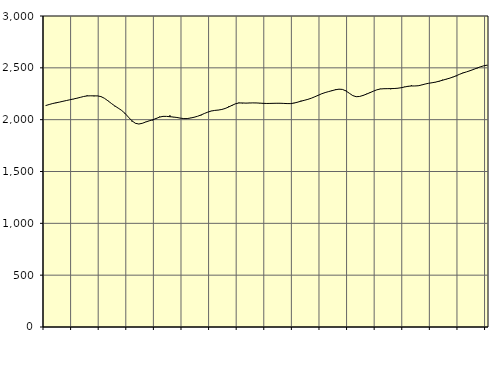
| Category | Piggar | Series 1 |
|---|---|---|
| nan | 2134.4 | 2136.11 |
| 87.0 | 2146.2 | 2146.18 |
| 87.0 | 2157.8 | 2155.55 |
| 87.0 | 2159.8 | 2162.88 |
| nan | 2168.8 | 2169.55 |
| 88.0 | 2177.6 | 2177.21 |
| 88.0 | 2183.8 | 2184.73 |
| 88.0 | 2192.1 | 2191.84 |
| nan | 2197.4 | 2199.26 |
| 89.0 | 2208.6 | 2206.71 |
| 89.0 | 2214.6 | 2215 |
| 89.0 | 2223 | 2223.6 |
| nan | 2234.6 | 2229.07 |
| 90.0 | 2229.1 | 2230.02 |
| 90.0 | 2225.9 | 2229.69 |
| 90.0 | 2230.2 | 2229.18 |
| nan | 2224.9 | 2222.76 |
| 91.0 | 2206 | 2206.45 |
| 91.0 | 2180.3 | 2182.7 |
| 91.0 | 2157.2 | 2157.04 |
| nan | 2129.4 | 2133.22 |
| 92.0 | 2112.6 | 2111.69 |
| 92.0 | 2090.5 | 2089.36 |
| 92.0 | 2064.3 | 2059.94 |
| nan | 2024.4 | 2023.58 |
| 93.0 | 1982.4 | 1988.72 |
| 93.0 | 1966.5 | 1965.09 |
| 93.0 | 1957.5 | 1958.14 |
| nan | 1966.1 | 1965.03 |
| 94.0 | 1979.1 | 1977.59 |
| 94.0 | 1989.9 | 1988.53 |
| 94.0 | 1992.7 | 1998.6 |
| nan | 2006.9 | 2011.55 |
| 95.0 | 2029 | 2024.65 |
| 95.0 | 2031.7 | 2031.88 |
| 95.0 | 2031.8 | 2031.65 |
| nan | 2041.9 | 2028.54 |
| 96.0 | 2023.4 | 2025.51 |
| 96.0 | 2024.2 | 2021.1 |
| 96.0 | 2016 | 2014.97 |
| nan | 2007.6 | 2010.35 |
| 97.0 | 2009.7 | 2010.63 |
| 97.0 | 2017.7 | 2015.91 |
| 97.0 | 2024 | 2023.25 |
| nan | 2032.2 | 2032.53 |
| 98.0 | 2041.2 | 2045.12 |
| 98.0 | 2058.9 | 2059.7 |
| 98.0 | 2073.5 | 2072.91 |
| nan | 2084.9 | 2083.36 |
| 99.0 | 2089.5 | 2089.2 |
| 99.0 | 2091.5 | 2092.69 |
| 99.0 | 2094.6 | 2098.01 |
| nan | 2106.5 | 2107.72 |
| 0.0 | 2127.1 | 2121.7 |
| 0.0 | 2132.8 | 2138.15 |
| 0.0 | 2154.4 | 2153.01 |
| nan | 2164.4 | 2160.94 |
| 1.0 | 2157.6 | 2161.31 |
| 1.0 | 2161 | 2159.67 |
| 1.0 | 2162.2 | 2160.54 |
| nan | 2162.4 | 2161.72 |
| 2.0 | 2162.1 | 2161.2 |
| 2.0 | 2157.4 | 2159.76 |
| 2.0 | 2159.9 | 2157.56 |
| nan | 2153.9 | 2156.13 |
| 3.0 | 2156 | 2156.73 |
| 3.0 | 2160.7 | 2157.69 |
| 3.0 | 2156.9 | 2158.35 |
| nan | 2155.5 | 2158.25 |
| 4.0 | 2155.3 | 2156.82 |
| 4.0 | 2151.8 | 2155.11 |
| 4.0 | 2153 | 2155.02 |
| nan | 2162.8 | 2159.91 |
| 5.0 | 2167 | 2168.8 |
| 5.0 | 2182.6 | 2178.17 |
| 5.0 | 2188.6 | 2187.01 |
| nan | 2195.5 | 2196.01 |
| 6.0 | 2207.5 | 2207.14 |
| 6.0 | 2220 | 2220.74 |
| 6.0 | 2233.2 | 2235.33 |
| nan | 2248.6 | 2249.71 |
| 7.0 | 2262.7 | 2261.38 |
| 7.0 | 2271.8 | 2270.66 |
| 7.0 | 2276.2 | 2279.77 |
| nan | 2293 | 2288.53 |
| 8.0 | 2292.1 | 2294.26 |
| 8.0 | 2291 | 2291.93 |
| 8.0 | 2282 | 2277.69 |
| nan | 2255.1 | 2254.99 |
| 9.0 | 2230.4 | 2232.28 |
| 9.0 | 2220.5 | 2221.66 |
| 9.0 | 2225.1 | 2223.91 |
| nan | 2230.2 | 2233.83 |
| 10.0 | 2249.5 | 2246.64 |
| 10.0 | 2257.1 | 2260.58 |
| 10.0 | 2275.6 | 2275.14 |
| nan | 2287.9 | 2288.1 |
| 11.0 | 2298.1 | 2295.9 |
| 11.0 | 2300.8 | 2298.43 |
| 11.0 | 2297.4 | 2299.1 |
| nan | 2293.3 | 2299.61 |
| 12.0 | 2303.4 | 2300.49 |
| 12.0 | 2300.8 | 2303.14 |
| 12.0 | 2308.3 | 2307.95 |
| nan | 2317.5 | 2314.9 |
| 13.0 | 2316.4 | 2321.88 |
| 13.0 | 2331.6 | 2324.88 |
| 13.0 | 2325.2 | 2325.11 |
| nan | 2325.1 | 2327.29 |
| 14.0 | 2336.1 | 2334.57 |
| 14.0 | 2343.5 | 2344.01 |
| 14.0 | 2350.1 | 2350.98 |
| nan | 2356.8 | 2356.18 |
| 15.0 | 2360.4 | 2362.19 |
| 15.0 | 2365.9 | 2370.59 |
| 15.0 | 2385.2 | 2380.02 |
| nan | 2386.5 | 2389.73 |
| 16.0 | 2401.5 | 2399.22 |
| 16.0 | 2412.9 | 2410.11 |
| 16.0 | 2419.2 | 2423.57 |
| nan | 2439 | 2438.17 |
| 17.0 | 2454.3 | 2450.84 |
| 17.0 | 2461.1 | 2461.3 |
| 17.0 | 2470.4 | 2472.08 |
| nan | 2489.2 | 2484.45 |
| 18.0 | 2493.2 | 2497.6 |
| 18.0 | 2508.8 | 2509.83 |
| 18.0 | 2520.8 | 2519.65 |
| nan | 2524 | 2526.26 |